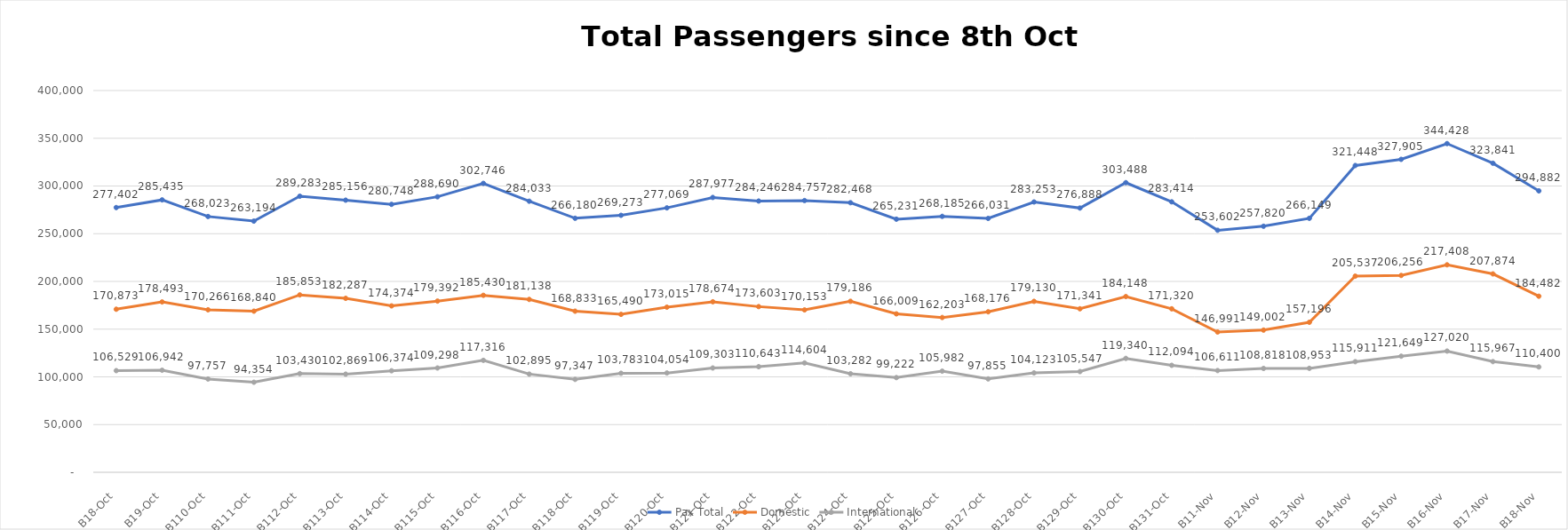
| Category | Pax Total |  Domestic  |  International  |
|---|---|---|---|
| 2022-10-08 | 277402 | 170873 | 106529 |
| 2022-10-09 | 285435 | 178493 | 106942 |
| 2022-10-10 | 268023 | 170266 | 97757 |
| 2022-10-11 | 263194 | 168840 | 94354 |
| 2022-10-12 | 289283 | 185853 | 103430 |
| 2022-10-13 | 285156 | 182287 | 102869 |
| 2022-10-14 | 280748 | 174374 | 106374 |
| 2022-10-15 | 288690 | 179392 | 109298 |
| 2022-10-16 | 302746 | 185430 | 117316 |
| 2022-10-17 | 284033 | 181138 | 102895 |
| 2022-10-18 | 266180 | 168833 | 97347 |
| 2022-10-19 | 269273 | 165490 | 103783 |
| 2022-10-20 | 277069 | 173015 | 104054 |
| 2022-10-21 | 287977 | 178674 | 109303 |
| 2022-10-22 | 284246 | 173603 | 110643 |
| 2022-10-23 | 284757 | 170153 | 114604 |
| 2022-10-24 | 282468 | 179186 | 103282 |
| 2022-10-25 | 265231 | 166009 | 99222 |
| 2022-10-26 | 268185 | 162203 | 105982 |
| 2022-10-27 | 266031 | 168176 | 97855 |
| 2022-10-28 | 283253 | 179130 | 104123 |
| 2022-10-29 | 276888 | 171341 | 105547 |
| 2022-10-30 | 303488 | 184148 | 119340 |
| 2022-10-31 | 283414 | 171320 | 112094 |
| 2022-11-01 | 253602 | 146991 | 106611 |
| 2022-11-02 | 257820 | 149002 | 108818 |
| 2022-11-03 | 266149 | 157196 | 108953 |
| 2022-11-04 | 321448 | 205537 | 115911 |
| 2022-11-05 | 327905 | 206256 | 121649 |
| 2022-11-06 | 344428 | 217408 | 127020 |
| 2022-11-07 | 323841 | 207874 | 115967 |
| 2022-11-08 | 294882 | 184482 | 110400 |